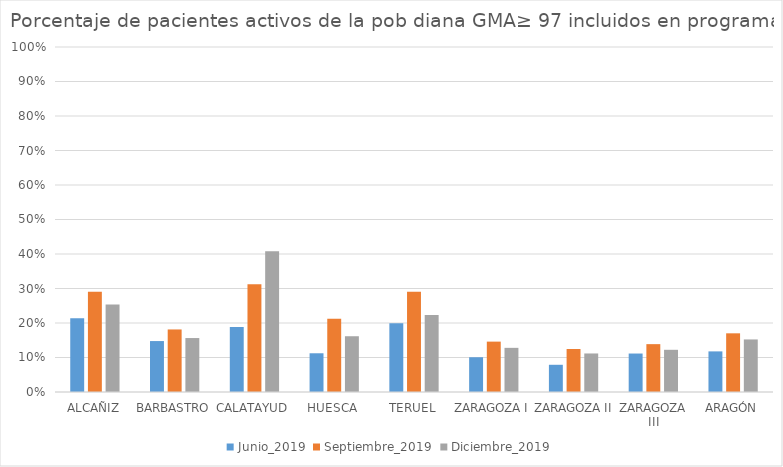
| Category | Junio_2019 | Septiembre_2019 | Diciembre_2019 |
|---|---|---|---|
| ALCAÑIZ | 0.214 | 0.29 | 0.254 |
| BARBASTRO | 0.148 | 0.181 | 0.156 |
| CALATAYUD | 0.188 | 0.312 | 0.408 |
| HUESCA | 0.112 | 0.212 | 0.162 |
| TERUEL | 0.199 | 0.291 | 0.223 |
| ZARAGOZA I | 0.101 | 0.146 | 0.128 |
| ZARAGOZA II | 0.079 | 0.125 | 0.112 |
| ZARAGOZA III | 0.112 | 0.139 | 0.122 |
| ARAGÓN | 0.118 | 0.17 | 0.152 |